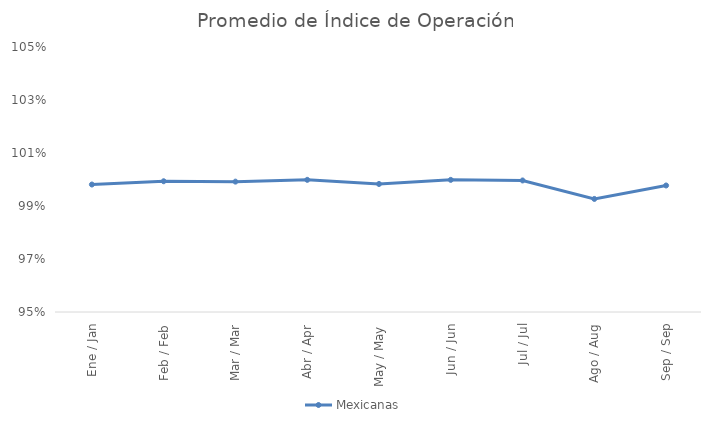
| Category | Mexicanas |
|---|---|
| Ene / Jan | 0.998 |
| Feb / Feb | 0.999 |
| Mar / Mar | 0.999 |
| Abr / Apr | 1 |
| May / May | 0.998 |
| Jun / Jun | 1 |
| Jul / Jul | 1 |
| Ago / Aug | 0.993 |
| Sep / Sep | 0.998 |